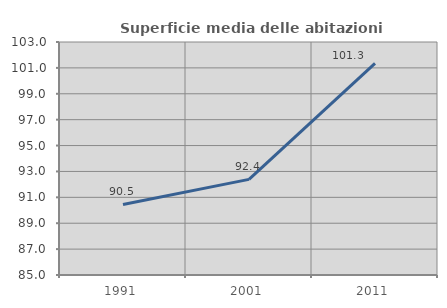
| Category | Superficie media delle abitazioni occupate |
|---|---|
| 1991.0 | 90.453 |
| 2001.0 | 92.385 |
| 2011.0 | 101.346 |